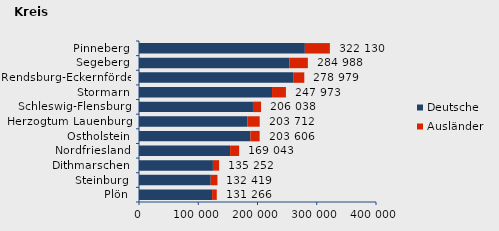
| Category | Deutsche | Ausländer | Series 2 |
|---|---|---|---|
| Plön | 123372 | 7894 | 131266 |
| Steinburg | 121031 | 11388 | 132419 |
| Dithmarschen | 124750 | 10502 | 135252 |
| Nordfriesland | 153739 | 15304 | 169043 |
| Ostholstein | 188035 | 15571 | 203606 |
| Herzogtum Lauenburg | 182791 | 20921 | 203712 |
| Schleswig-Flensburg | 192361 | 13677 | 206038 |
| Stormarn | 224528 | 23445 | 247973 |
| Rendsburg-Eckernförde | 260121 | 18858 | 278979 |
| Segeberg | 254194 | 30794 | 284988 |
| Pinneberg | 279952 | 42178 | 322130 |